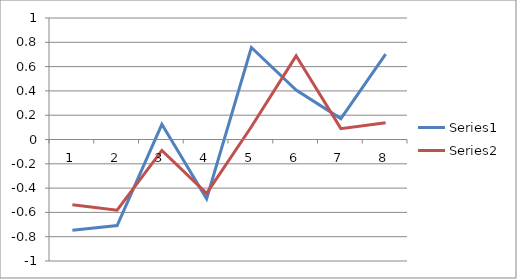
| Category | Series 0 | Series 1 |
|---|---|---|
| 0 | -0.747 | -0.538 |
| 1 | -0.709 | -0.582 |
| 2 | 0.125 | -0.09 |
| 3 | -0.487 | -0.444 |
| 4 | 0.757 | 0.105 |
| 5 | 0.407 | 0.689 |
| 6 | 0.172 | 0.089 |
| 7 | 0.702 | 0.138 |